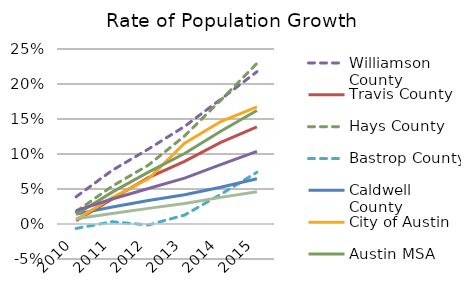
| Category | Williamson County | Travis County | Hays County | Bastrop County | Caldwell County | City of Austin | Austin MSA | Texas | USA |
|---|---|---|---|---|---|---|---|---|---|
| 2010.0 | 0.039 | 0.005 | 0.018 | -0.006 | 0.014 | 0.006 | 0.014 | 0.019 | 0.008 |
| 2011.0 | 0.077 | 0.036 | 0.054 | 0.003 | 0.024 | 0.038 | 0.046 | 0.036 | 0.015 |
| 2012.0 | 0.107 | 0.066 | 0.084 | -0.001 | 0.034 | 0.065 | 0.074 | 0.051 | 0.022 |
| 2013.0 | 0.139 | 0.09 | 0.126 | 0.013 | 0.042 | 0.115 | 0.101 | 0.066 | 0.029 |
| 2014.0 | 0.178 | 0.117 | 0.177 | 0.042 | 0.052 | 0.146 | 0.133 | 0.085 | 0.038 |
| 2015.0 | 0.218 | 0.139 | 0.229 | 0.074 | 0.065 | 0.167 | 0.162 | 0.104 | 0.046 |